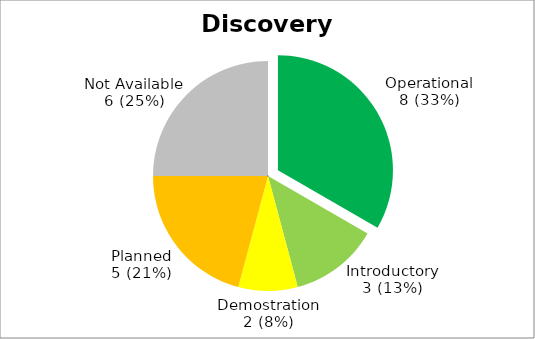
| Category | Series 0 |
|---|---|
| Operational? | 8 |
| Introductory? | 3 |
| Demonstration? | 2 |
| Planned? | 5 |
| Not Available? | 6 |